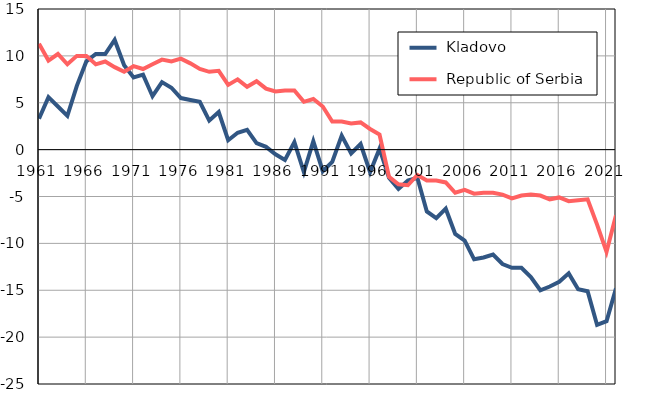
| Category |  Kladovo |  Republic of Serbia |
|---|---|---|
| 1961.0 | 3.3 | 11.3 |
| 1962.0 | 5.6 | 9.5 |
| 1963.0 | 4.6 | 10.2 |
| 1964.0 | 3.6 | 9.1 |
| 1965.0 | 6.8 | 10 |
| 1966.0 | 9.4 | 10 |
| 1967.0 | 10.2 | 9.1 |
| 1968.0 | 10.2 | 9.4 |
| 1969.0 | 11.7 | 8.8 |
| 1970.0 | 9 | 8.3 |
| 1971.0 | 7.7 | 8.9 |
| 1972.0 | 8 | 8.6 |
| 1973.0 | 5.7 | 9.1 |
| 1974.0 | 7.2 | 9.6 |
| 1975.0 | 6.6 | 9.4 |
| 1976.0 | 5.5 | 9.7 |
| 1977.0 | 5.3 | 9.2 |
| 1978.0 | 5.1 | 8.6 |
| 1979.0 | 3.1 | 8.3 |
| 1980.0 | 4 | 8.4 |
| 1981.0 | 1 | 6.9 |
| 1982.0 | 1.8 | 7.5 |
| 1983.0 | 2.1 | 6.7 |
| 1984.0 | 0.7 | 7.3 |
| 1985.0 | 0.3 | 6.5 |
| 1986.0 | -0.5 | 6.2 |
| 1987.0 | -1.1 | 6.3 |
| 1988.0 | 0.8 | 6.3 |
| 1989.0 | -2.4 | 5.1 |
| 1990.0 | 0.9 | 5.4 |
| 1991.0 | -2.3 | 4.6 |
| 1992.0 | -1.3 | 3 |
| 1993.0 | 1.5 | 3 |
| 1994.0 | -0.4 | 2.8 |
| 1995.0 | 0.6 | 2.9 |
| 1996.0 | -2.4 | 2.2 |
| 1997.0 | 0.1 | 1.6 |
| 1998.0 | -3 | -2.9 |
| 1999.0 | -4.2 | -3.7 |
| 2000.0 | -3.3 | -3.8 |
| 2001.0 | -3 | -2.7 |
| 2002.0 | -6.6 | -3.3 |
| 2003.0 | -7.3 | -3.3 |
| 2004.0 | -6.3 | -3.5 |
| 2005.0 | -9 | -4.6 |
| 2006.0 | -9.7 | -4.3 |
| 2007.0 | -11.7 | -4.7 |
| 2008.0 | -11.5 | -4.6 |
| 2009.0 | -11.2 | -4.6 |
| 2010.0 | -12.2 | -4.8 |
| 2011.0 | -12.6 | -5.2 |
| 2012.0 | -12.6 | -4.9 |
| 2013.0 | -13.6 | -4.8 |
| 2014.0 | -15 | -4.9 |
| 2015.0 | -14.6 | -5.3 |
| 2016.0 | -14.1 | -5.1 |
| 2017.0 | -13.2 | -5.5 |
| 2018.0 | -14.9 | -5.4 |
| 2019.0 | -15.1 | -5.3 |
| 2020.0 | -18.7 | -8 |
| 2021.0 | -18.3 | -10.9 |
| 2022.0 | -14.8 | -7 |